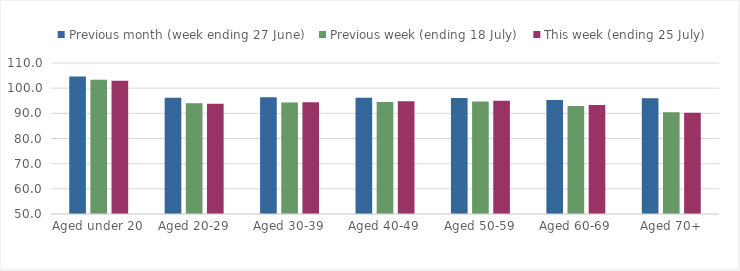
| Category | Previous month (week ending 27 June) | Previous week (ending 18 July) | This week (ending 25 July) |
|---|---|---|---|
| Aged under 20 | 104.63 | 103.393 | 102.991 |
| Aged 20-29 | 96.216 | 94 | 93.846 |
| Aged 30-39 | 96.353 | 94.331 | 94.381 |
| Aged 40-49 | 96.237 | 94.553 | 94.835 |
| Aged 50-59 | 96.114 | 94.693 | 95.043 |
| Aged 60-69 | 95.289 | 92.958 | 93.262 |
| Aged 70+ | 95.972 | 90.407 | 90.245 |